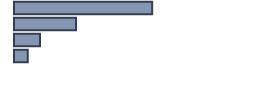
| Category | Percentatge |
|---|---|
| 0 | 57.576 |
| 1 | 25.833 |
| 2 | 10.833 |
| 3 | 5.758 |
| 4 | 0 |